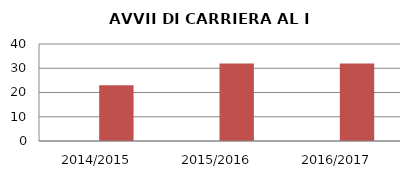
| Category | ANNO | NUMERO |
|---|---|---|
| 2014/2015 | 0 | 23 |
| 2015/2016 | 0 | 32 |
| 2016/2017 | 0 | 32 |